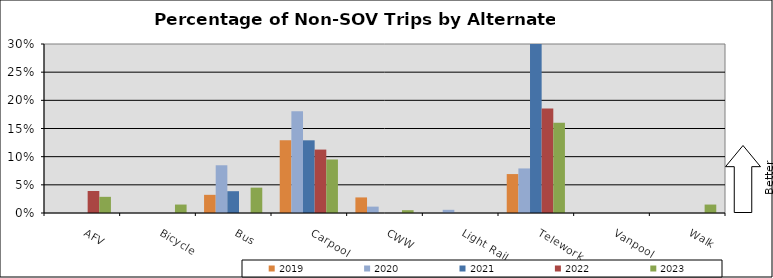
| Category | 2019 | 2020 | 2021 | 2022 | 2023 |
|---|---|---|---|---|---|
| AFV | 0 | 0 | 0 | 0.039 | 0.029 |
| Bicycle | 0 | 0 | 0 | 0 | 0.015 |
| Bus | 0.032 | 0.085 | 0.039 | 0 | 0.045 |
| Carpool | 0.129 | 0.181 | 0.129 | 0.113 | 0.095 |
| CWW | 0.028 | 0.011 | 0 | 0 | 0.005 |
| Light Rail | 0 | 0.006 | 0 | 0 | 0 |
| Telework | 0.069 | 0.079 | 0.323 | 0.185 | 0.16 |
| Vanpool | 0 | 0 | 0 | 0 | 0 |
| Walk | 0 | 0 | 0 | 0 | 0.015 |